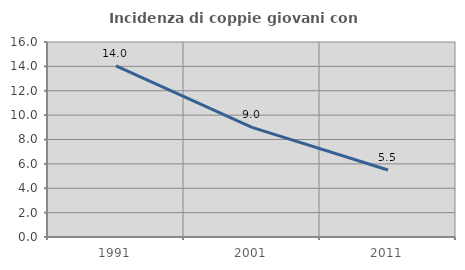
| Category | Incidenza di coppie giovani con figli |
|---|---|
| 1991.0 | 14.035 |
| 2001.0 | 8.995 |
| 2011.0 | 5.495 |